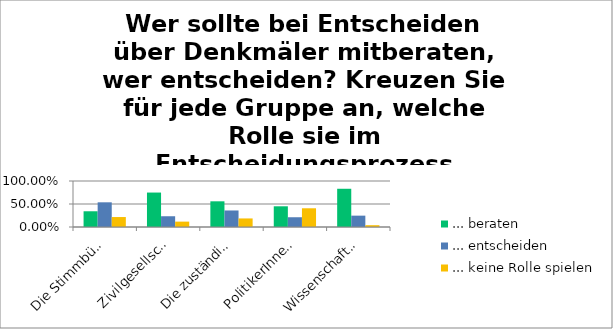
| Category | ... beraten | ... entscheiden | ... keine Rolle spielen |
|---|---|---|---|
| Die StimmbürgerInnen sollten... | 0.342 | 0.537 | 0.216 |
| Zivilgesellschaftliche Gruppen sollten... | 0.749 | 0.234 | 0.117 |
| Die zuständigen Ämter und Behörden sollten... | 0.558 | 0.359 | 0.186 |
| PolitikerInnen sollten... | 0.45 | 0.212 | 0.407 |
| WissenschaftlerInnen (z.B. HistorikerInnen) sollten... | 0.831 | 0.247 | 0.039 |